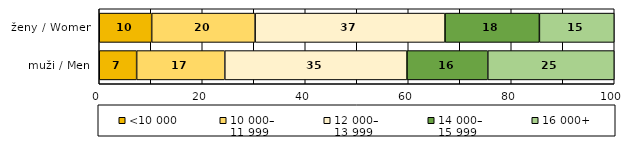
| Category | <10 000 | 10 000–
11 999 | 12 000–
13 999 | 14 000–
15 999 | 16 000+ |
|---|---|---|---|---|---|
| muži / Men | 7.263 | 17.119 | 35.376 | 15.691 | 24.552 |
| ženy / Women | 10.18 | 20.088 | 36.872 | 18.326 | 14.535 |